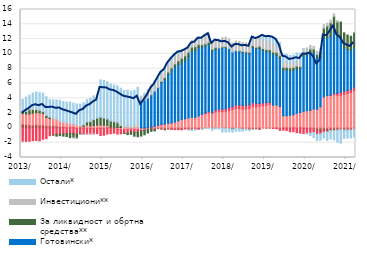
| Category | По трансакционим рачунима | Стамбени | Потрошачки | Готовински* | За ликвидност и обртна средства** | Инвестициони** | Остали* |
|---|---|---|---|---|---|---|---|
| 2013-01-01 | 0.508 | 1.431 | -1.847 | 0 | 0.247 | -0.025 | 1.661 |
| 2013-02-01 | 0.453 | 1.445 | -1.828 | 0 | 0.347 | 0.059 | 1.858 |
| 2013-03-01 | 0.396 | 1.481 | -1.809 | 0 | 0.577 | 0.174 | 1.791 |
| 2013-04-01 | 0.363 | 1.611 | -1.729 | 0 | 0.524 | 0.158 | 2.057 |
| 2013-05-01 | 0.428 | 1.629 | -1.697 | 0 | 0.421 | 0.119 | 2.236 |
| 2013-06-01 | 0.354 | 1.679 | -1.76 | 0 | 0.356 | 0.073 | 2.298 |
| 2013-07-01 | 0.377 | 1.547 | -1.534 | 0 | 0.28 | 0.055 | 2.445 |
| 2013-08-01 | 0.277 | 1.122 | -1.451 | 0 | 0.273 | 0.107 | 2.436 |
| 2013-09-01 | 0.283 | 0.981 | -1.058 | 0 | 0.173 | 0.116 | 2.267 |
| 2013-10-01 | 0.296 | 0.993 | -0.949 | 0 | -0.033 | 0.081 | 2.425 |
| 2013-11-01 | 0.234 | 0.883 | -0.898 | 0 | -0.218 | 0.069 | 2.571 |
| 2013-12-01 | 0.178 | 0.692 | -0.843 | 0 | -0.202 | 0.115 | 2.751 |
| 2014-01-01 | 0.161 | 0.59 | -0.827 | 0 | -0.283 | 0.112 | 2.704 |
| 2014-02-01 | 0.047 | 0.58 | -0.791 | 0 | -0.379 | 0.1 | 2.763 |
| 2014-03-01 | 0.093 | 0.545 | -0.742 | 0 | -0.569 | 0.016 | 2.827 |
| 2014-04-01 | 0.086 | 0.425 | -0.769 | 0 | -0.554 | -0.011 | 2.841 |
| 2014-05-01 | -0.103 | 0.39 | -0.777 | 0 | -0.503 | -0.016 | 2.846 |
| 2014-06-01 | 0.02 | 0.27 | -0.77 | 0 | -0.102 | -0.004 | 2.917 |
| 2014-07-01 | -0.1 | 0.167 | -0.769 | 0 | 0.237 | -0.031 | 2.979 |
| 2014-08-01 | -0.098 | 0.395 | -0.748 | 0 | 0.414 | -0.032 | 3.01 |
| 2014-09-01 | -0.081 | 0.267 | -0.729 | 0 | 0.594 | -0.055 | 3.145 |
| 2014-10-01 | -0.149 | 0.302 | -0.669 | 0 | 0.817 | -0.022 | 3.213 |
| 2014-11-01 | -0.14 | 0.382 | -0.636 | 0 | 0.945 | 0.036 | 3.176 |
| 2014-12-01 | -0.096 | 0.404 | -0.93 | 0 | 1.047 | 0.02 | 5.023 |
| 2015-01-01 | -0.103 | 0.371 | -0.88 | 0 | 0.971 | 0.029 | 5.041 |
| 2015-02-01 | 0.049 | 0.294 | -0.837 | 0 | 0.885 | 0.01 | 4.996 |
| 2015-03-01 | 0.079 | 0.039 | -0.79 | 0 | 0.818 | 0.043 | 4.945 |
| 2015-04-01 | 0.097 | -0.029 | -0.7 | 0 | 0.733 | 0.112 | 4.846 |
| 2015-05-01 | 0.037 | -0.211 | -0.623 | 0 | 0.663 | 0.156 | 4.828 |
| 2015-06-01 | 0.048 | -0.237 | -0.564 | 0 | 0.273 | 0.217 | 4.827 |
| 2015-07-01 | 0.011 | -0.222 | -0.512 | 0 | -0.03 | 0.258 | 4.777 |
| 2015-08-01 | 0.06 | -0.235 | -0.472 | 0 | -0.202 | 0.254 | 4.784 |
| 2015-09-01 | -0.027 | -0.077 | -0.415 | 0 | -0.356 | 0.321 | 4.643 |
| 2015-10-01 | -0.034 | -0.17 | -0.385 | 0 | -0.533 | 0.409 | 4.662 |
| 2015-11-01 | 0.008 | -0.216 | -0.356 | 0 | -0.624 | 0.491 | 4.982 |
| 2015-12-01 | -0.089 | -0.265 | -0.024 | 3.632 | -0.722 | 0.632 | 0.016 |
| 2016-01-01 | -0.127 | -0.175 | -0.021 | 3.762 | -0.611 | 0.682 | 0.257 |
| 2016-02-01 | -0.043 | -0.189 | 0.001 | 4.013 | -0.457 | 0.748 | 0.372 |
| 2016-03-01 | -0.152 | 0.065 | 0.042 | 4.376 | -0.299 | 0.899 | 0.433 |
| 2016-04-01 | -0.291 | 0.194 | 0.05 | 4.714 | -0.12 | 0.918 | 0.433 |
| 2016-05-01 | -0.108 | 0.303 | 0.059 | 5.046 | 0.031 | 0.954 | 0.425 |
| 2016-06-01 | -0.176 | 0.432 | 0.056 | 5.656 | 0.139 | 0.962 | 0.437 |
| 2016-07-01 | -0.255 | 0.503 | 0.03 | 6.024 | 0.239 | 0.947 | 0.404 |
| 2016-08-01 | -0.154 | 0.606 | 0.004 | 6.623 | 0.307 | 0.957 | 0.426 |
| 2016-09-01 | -0.178 | 0.661 | -0.02 | 7.102 | 0.348 | 1.031 | 0.396 |
| 2016-10-01 | -0.176 | 0.793 | -0.055 | 7.461 | 0.394 | 1.006 | 0.414 |
| 2016-11-01 | -0.174 | 0.952 | -0.065 | 7.609 | 0.499 | 0.969 | 0.433 |
| 2016-12-01 | -0.201 | 1.131 | -0.045 | 7.685 | 0.596 | 0.886 | 0.263 |
| 2017-01-01 | -0.106 | 1.22 | -0.024 | 7.92 | 0.595 | 0.87 | 0.053 |
| 2017-02-01 | -0.207 | 1.343 | -0.03 | 8.279 | 0.584 | 0.861 | -0.029 |
| 2017-03-01 | -0.208 | 1.424 | -0.041 | 8.897 | 0.588 | 0.894 | -0.087 |
| 2017-04-01 | -0.152 | 1.419 | -0.038 | 9.037 | 0.509 | 0.925 | -0.101 |
| 2017-05-01 | -0.139 | 1.617 | -0.009 | 9.239 | 0.4 | 0.979 | 0.036 |
| 2017-06-01 | -0.149 | 1.807 | 0.026 | 9.09 | 0.33 | 1.082 | -0.071 |
| 2017-07-01 | -0.013 | 1.938 | 0.095 | 9.039 | 0.286 | 1.153 | -0.047 |
| 2017-08-01 | -0.026 | 2.037 | 0.187 | 9.028 | 0.319 | 1.239 | -0.048 |
| 2017-09-01 | -0.096 | 1.953 | 0.144 | 8.311 | 0.208 | 1.123 | -0.228 |
| 2017-10-01 | -0.014 | 2.157 | 0.238 | 8.209 | 0.241 | 1.163 | -0.142 |
| 2017-11-01 | -0.023 | 2.254 | 0.303 | 8.195 | 0.045 | 1.16 | -0.142 |
| 2017-12-01 | -0.056 | 2.205 | 0.311 | 8.33 | 0.09 | 1.26 | -0.508 |
| 2018-01-01 | -0.081 | 2.265 | 0.327 | 8.3 | 0.083 | 1.278 | -0.481 |
| 2018-02-01 | -0.113 | 2.34 | 0.369 | 7.965 | 0.047 | 1.301 | -0.424 |
| 2018-03-01 | -0.111 | 2.495 | 0.416 | 7.335 | -0.033 | 1.25 | -0.433 |
| 2018-04-01 | -0.081 | 2.649 | 0.463 | 7.33 | -0.002 | 1.282 | -0.359 |
| 2018-05-01 | -0.115 | 2.601 | 0.491 | 7.248 | 0.078 | 1.279 | -0.329 |
| 2018-06-01 | -0.166 | 2.547 | 0.505 | 7.138 | 0.143 | 1.197 | -0.261 |
| 2018-07-01 | -0.145 | 2.554 | 0.495 | 7.101 | 0.124 | 1.2 | -0.178 |
| 2018-08-01 | -0.225 | 2.647 | 0.474 | 6.992 | 0.092 | 1.178 | -0.137 |
| 2018-09-01 | -0.14 | 2.915 | 0.498 | 7.489 | 0.205 | 1.226 | 0.07 |
| 2018-10-01 | -0.125 | 2.846 | 0.442 | 7.456 | 0.158 | 1.193 | 0.104 |
| 2018-11-01 | -0.206 | 2.929 | 0.385 | 7.416 | 0.306 | 1.244 | 0.165 |
| 2018-12-01 | -0.005 | 3.009 | 0.366 | 7.096 | 0.257 | 1.224 | 0.559 |
| 2019-01-01 | -0.045 | 3.078 | 0.343 | 6.898 | 0.267 | 1.186 | 0.594 |
| 2019-02-01 | -0.024 | 3.175 | 0.284 | 6.823 | 0.273 | 1.178 | 0.658 |
| 2019-03-01 | -0.041 | 3.067 | -0.017 | 6.909 | 0.281 | 1.148 | 0.909 |
| 2019-04-01 | -0.041 | 3.102 | -0.071 | 6.728 | 0.35 | 0.959 | 0.944 |
| 2019-05-01 | -0.101 | 2.892 | -0.229 | 6.532 | 0.332 | 0.851 | 0.917 |
| 2019-06-01 | -0.032 | 1.641 | -0.277 | 6.225 | 0.324 | 0.815 | 0.995 |
| 2019-07-01 | -0.025 | 1.64 | -0.34 | 6.167 | 0.367 | 0.718 | 1.061 |
| 2019-08-01 | -0.025 | 1.693 | -0.499 | 6.043 | 0.38 | 0.64 | 1.02 |
| 2019-09-01 | 0.002 | 1.775 | -0.51 | 6.049 | 0.332 | 0.612 | 1.07 |
| 2019-10-01 | -0.05 | 1.982 | -0.601 | 6.001 | 0.376 | 0.64 | 1.135 |
| 2019-11-01 | 0.007 | 2.063 | -0.707 | 6.01 | 0.22 | 0.687 | 1.09 |
| 2019-12-01 | -0.045 | 2.247 | -0.705 | 7.459 | 0.31 | 0.604 | 0.109 |
| 2020-01-31 | -0.067 | 2.32 | -0.682 | 7.598 | 0.358 | 0.543 | -0.107 |
| 2020-02-29 | -0.05 | 2.357 | -0.646 | 7.878 | 0.431 | 0.481 | -0.343 |
| 2020-03-31 | -0.142 | 2.559 | -0.469 | 7.592 | 0.497 | 0.362 | -0.693 |
| 2020-04-30 | -0.391 | 2.519 | -0.482 | 6.976 | 0.428 | 0.428 | -0.807 |
| 2020-05-31 | -0.497 | 2.845 | -0.315 | 6.823 | 0.636 | 0.451 | -0.835 |
| 2020-06-30 | -0.368 | 4.188 | -0.212 | 7.993 | 1.298 | 0.472 | -0.814 |
| 2020-07-31 | -0.412 | 4.363 | -0.136 | 7.827 | 1.569 | 0.389 | -1.144 |
| 2020-08-31 | -0.35 | 4.374 | 0.053 | 7.995 | 1.779 | 0.365 | -1.139 |
| 2020-09-30 | -0.363 | 4.491 | 0.175 | 8.283 | 2.132 | 0.326 | -1.274 |
| 2020-10-31 | -0.292 | 4.411 | 0.268 | 7.607 | 2.03 | 0.189 | -1.627 |
| 2020-11-30 | -0.235 | 4.434 | 0.387 | 7.362 | 2.118 | -0.01 | -1.811 |
| 2020-12-31 | -0.3 | 4.547 | 0.414 | 5.86 | 2.023 | -0.042 | -1.076 |
| 2021-01-31 | -0.28 | 4.676 | 0.397 | 5.527 | 1.958 | -0.051 | -1.044 |
| 2021-02-28 | -0.274 | 4.804 | 0.394 | 5.276 | 1.914 | -0.107 | -0.992 |
| 2021-03-31 | -0.144 | 5.051 | 0.432 | 5.319 | 2.021 | -0.132 | -0.998 |